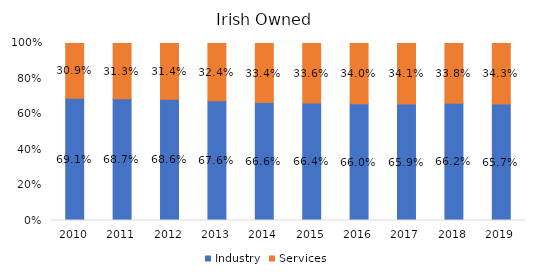
| Category | Industry | Services |
|---|---|---|
| 2010.0 | 0.691 | 0.309 |
| 2011.0 | 0.687 | 0.313 |
| 2012.0 | 0.686 | 0.314 |
| 2013.0 | 0.676 | 0.324 |
| 2014.0 | 0.666 | 0.334 |
| 2015.0 | 0.664 | 0.336 |
| 2016.0 | 0.66 | 0.34 |
| 2017.0 | 0.659 | 0.341 |
| 2018.0 | 0.662 | 0.338 |
| 2019.0 | 0.657 | 0.343 |